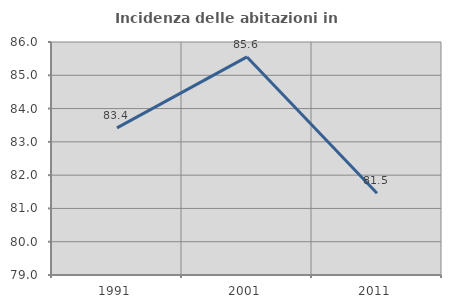
| Category | Incidenza delle abitazioni in proprietà  |
|---|---|
| 1991.0 | 83.422 |
| 2001.0 | 85.552 |
| 2011.0 | 81.457 |